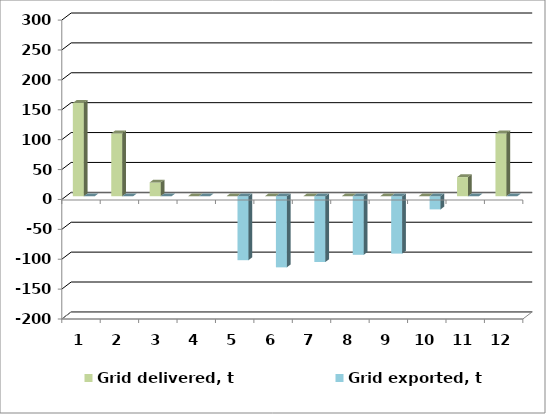
| Category | Grid delivered, t | Grid exported, t |
|---|---|---|
| 0 | 156 | 0 |
| 1 | 105 | 0 |
| 2 | 23 | 0 |
| 3 | 0 | 0 |
| 4 | 0 | -107 |
| 5 | 0 | -119 |
| 6 | 0 | -110 |
| 7 | 0 | -98 |
| 8 | 0 | -96 |
| 9 | 0 | -22 |
| 10 | 32 | 0 |
| 11 | 105 | 0 |